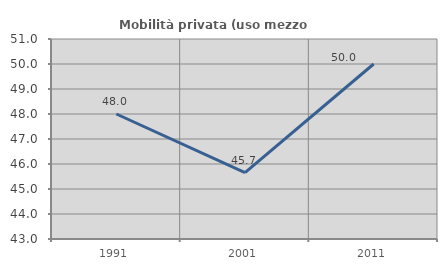
| Category | Mobilità privata (uso mezzo privato) |
|---|---|
| 1991.0 | 48 |
| 2001.0 | 45.652 |
| 2011.0 | 50 |